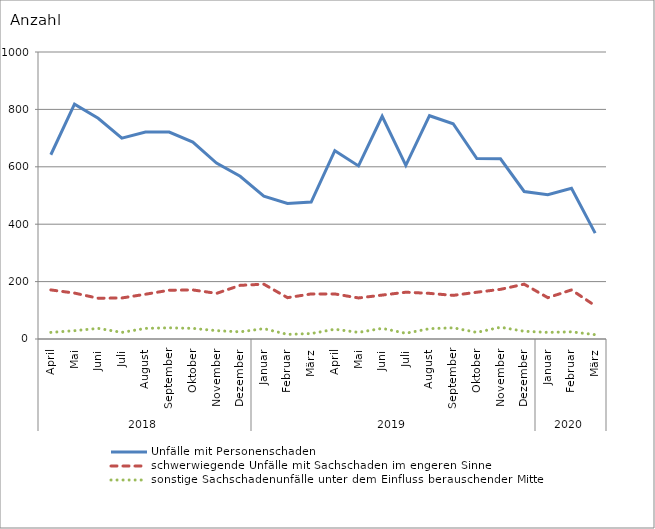
| Category | Unfälle mit Personenschaden | schwerwiegende Unfälle mit Sachschaden im engeren Sinne | sonstige Sachschadenunfälle unter dem Einfluss berauschender Mittel |
|---|---|---|---|
| 0 | 642 | 171 | 23 |
| 1 | 818 | 160 | 29 |
| 2 | 769 | 142 | 37 |
| 3 | 700 | 143 | 23 |
| 4 | 721 | 156 | 37 |
| 5 | 721 | 170 | 39 |
| 6 | 686 | 171 | 37 |
| 7 | 613 | 159 | 29 |
| 8 | 567 | 187 | 25 |
| 9 | 498 | 191 | 36 |
| 10 | 472 | 144 | 16 |
| 11 | 477 | 157 | 19 |
| 12 | 656 | 157 | 34 |
| 13 | 603 | 143 | 23 |
| 14 | 776 | 153 | 37 |
| 15 | 605 | 163 | 20 |
| 16 | 778 | 159 | 36 |
| 17 | 750 | 152 | 39 |
| 18 | 629 | 163 | 23 |
| 19 | 628 | 173 | 41 |
| 20 | 514 | 191 | 27 |
| 21 | 503 | 144 | 23 |
| 22 | 525 | 171 | 25 |
| 23 | 369 | 116 | 15 |